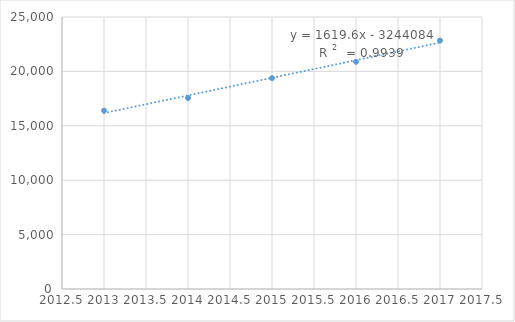
| Category | Series 0 |
|---|---|
| 2013.0 | 16397 |
| 2014.0 | 17559 |
| 2015.0 | 19379 |
| 2016.0 | 20881 |
| 2017.0 | 22834 |